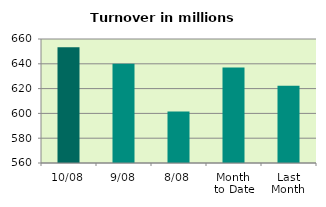
| Category | Series 0 |
|---|---|
| 10/08 | 653.32 |
| 9/08 | 639.953 |
| 8/08 | 601.482 |
| Month 
to Date | 636.922 |
| Last
Month | 622.259 |